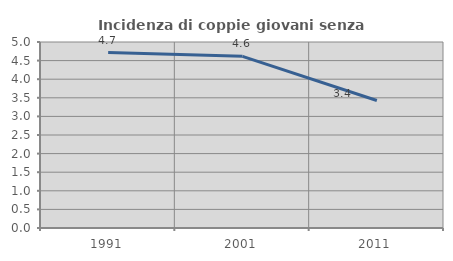
| Category | Incidenza di coppie giovani senza figli |
|---|---|
| 1991.0 | 4.715 |
| 2001.0 | 4.615 |
| 2011.0 | 3.427 |